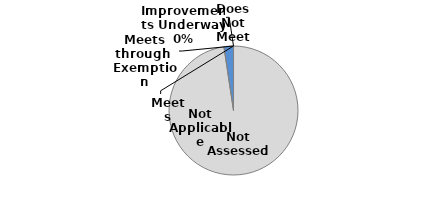
| Category | Series 0 |
|---|---|
| Not Assessed | 41 |
| Not Applicable | 1 |
| Meets | 0 |
| Meets through  Exemption | 0 |
| Improvements Underway | 0 |
| Does Not Meet | 0 |